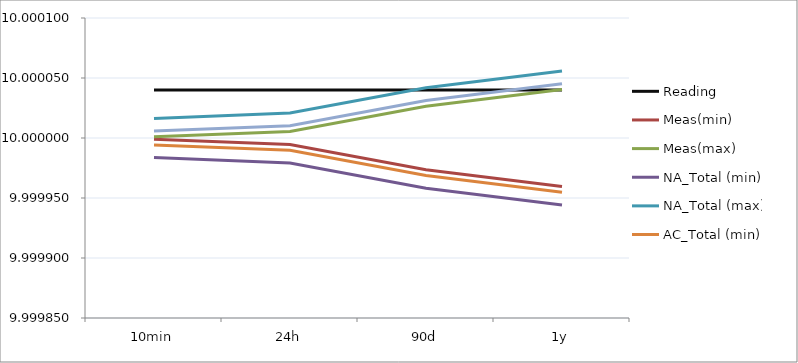
| Category | Reading | Meas(min) | Meas(max) | NA_Total (min) | NA_Total (max) | AC_Total (min) | AC_Total (max) |
|---|---|---|---|---|---|---|---|
| 10min | 10 | 10 | 10 | 10 | 10 | 10 | 10 |
| 24h | 10 | 10 | 10 | 10 | 10 | 10 | 10 |
| 90d | 10 | 10 | 10 | 10 | 10 | 10 | 10 |
| 1y | 10 | 10 | 10 | 10 | 10 | 10 | 10 |